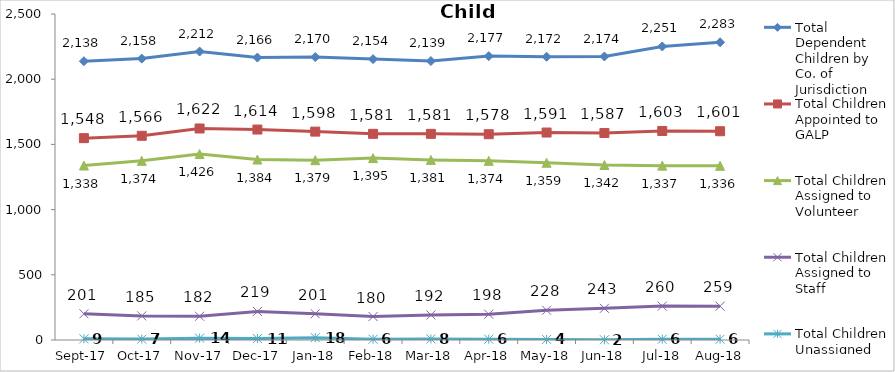
| Category | Total Dependent Children by Co. of Jurisdiction | Total Children Appointed to GALP | Total Children Assigned to Volunteer | Total Children Assigned to Staff | Total Children Unassigned |
|---|---|---|---|---|---|
| 2017-09-01 | 2138 | 1548 | 1338 | 201 | 9 |
| 2017-10-01 | 2158 | 1566 | 1374 | 185 | 7 |
| 2017-11-01 | 2212 | 1622 | 1426 | 182 | 14 |
| 2017-12-01 | 2166 | 1614 | 1384 | 219 | 11 |
| 2018-01-01 | 2170 | 1598 | 1379 | 201 | 18 |
| 2018-02-01 | 2154 | 1581 | 1395 | 180 | 6 |
| 2018-03-01 | 2139 | 1581 | 1381 | 192 | 8 |
| 2018-04-01 | 2177 | 1578 | 1374 | 198 | 6 |
| 2018-05-01 | 2172 | 1591 | 1359 | 228 | 4 |
| 2018-06-01 | 2174 | 1587 | 1342 | 243 | 2 |
| 2018-07-01 | 2251 | 1603 | 1337 | 260 | 6 |
| 2018-08-01 | 2283 | 1601 | 1336 | 259 | 6 |